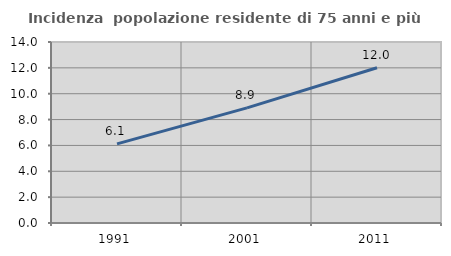
| Category | Incidenza  popolazione residente di 75 anni e più |
|---|---|
| 1991.0 | 6.122 |
| 2001.0 | 8.904 |
| 2011.0 | 12.009 |